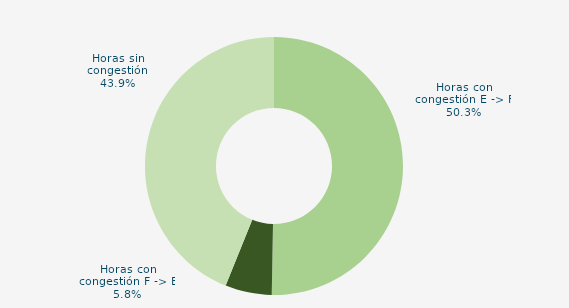
| Category | Horas con congestión E -> F |
|---|---|
| Horas con congestión E -> F | 50.278 |
| Horas con congestión F -> E | 5.833 |
| Horas sin congestión | 43.889 |